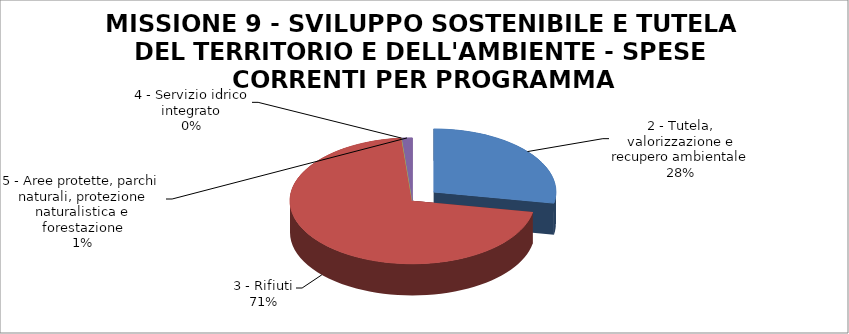
| Category | Series 0 |
|---|---|
| 2 - Tutela, valorizzazione e recupero ambientale | 1830745 |
| 3 - Rifiuti | 4650049 |
| 4 - Servizio idrico integrato | 2164 |
| 5 - Aree protette, parchi naturali, protezione naturalistica e forestazione | 90677 |